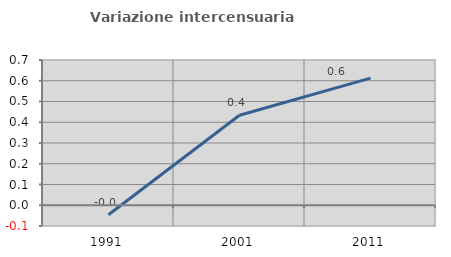
| Category | Variazione intercensuaria annua |
|---|---|
| 1991.0 | -0.046 |
| 2001.0 | 0.434 |
| 2011.0 | 0.613 |